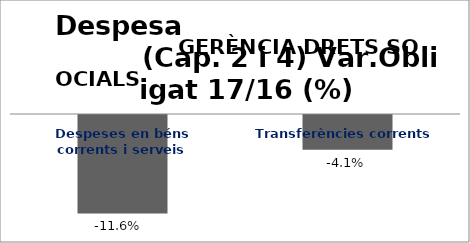
| Category | Series 0 |
|---|---|
| Despeses en béns corrents i serveis | -0.116 |
| Transferències corrents | -0.041 |